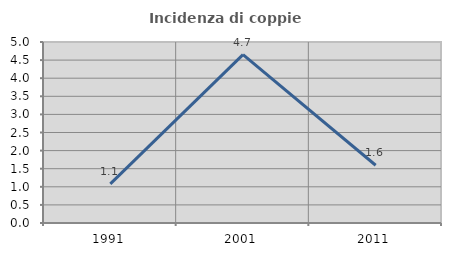
| Category | Incidenza di coppie miste |
|---|---|
| 1991.0 | 1.081 |
| 2001.0 | 4.651 |
| 2011.0 | 1.596 |